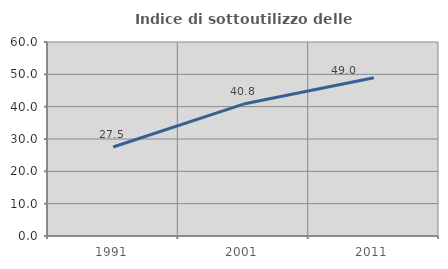
| Category | Indice di sottoutilizzo delle abitazioni  |
|---|---|
| 1991.0 | 27.513 |
| 2001.0 | 40.807 |
| 2011.0 | 48.961 |